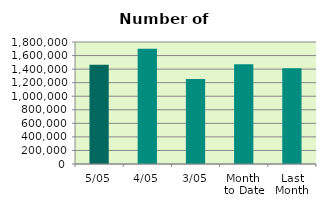
| Category | Series 0 |
|---|---|
| 5/05 | 1464956 |
| 4/05 | 1699326 |
| 3/05 | 1254956 |
| Month 
to Date | 1473079.333 |
| Last
Month | 1414476.2 |